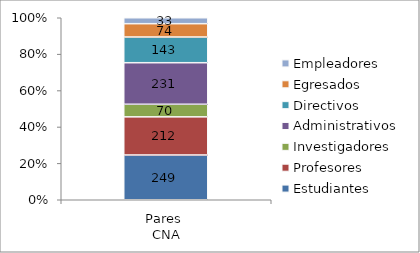
| Category | Estudiantes | Profesores | Investigadores | Administrativos  | Directivos | Egresados | Empleadores |
|---|---|---|---|---|---|---|---|
| Pares 
CNA | 249 | 212 | 70 | 231 | 143 | 74 | 33 |